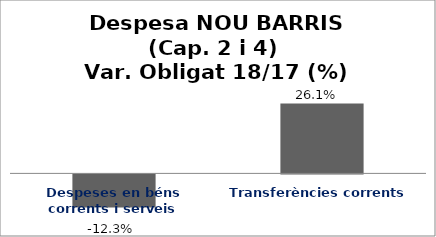
| Category | Series 0 |
|---|---|
| Despeses en béns corrents i serveis | -0.123 |
| Transferències corrents | 0.261 |